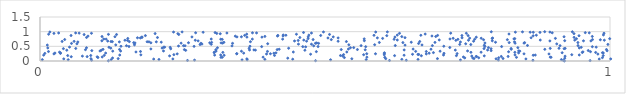
| Category | Series 0 |
|---|---|
| 2.2737618863979288 | 0.001 |
| 0.9201490768364133 | 0.002 |
| 1.637942919697557 | 0.003 |
| 1.9332591636446765 | 0.004 |
| 5.7513697663995185 | 0.005 |
| 0.1199243591047257 | 0.006 |
| 1.3459629498587193 | 0.007 |
| 2.8235011995106 | 0.008 |
| 2.5908782332994593 | 0.009 |
| 1.2472821126119067 | 0.01 |
| 0.4834265680161382 | 0.011 |
| 1.3550923501502299 | 0.012 |
| 0.9651213114938526 | 0.013 |
| 1.0503276894264808 | 0.014 |
| 0.9184804380166401 | 0.015 |
| 6.808566963321208 | 0.016 |
| 0.6130973295228077 | 0.017 |
| 0.2587598203045701 | 0.018 |
| 1.9505109192614207 | 0.019 |
| 3.041999003138373 | 0.02 |
| 1.7741115447497993 | 0.021 |
| 1.235638835491181 | 0.022 |
| 0.6426469469683878 | 0.023 |
| 0.8647900470202449 | 0.024 |
| 0.09055686671678105 | 0.025 |
| 5.7124977589136225 | 0.026 |
| 1.7970386531356328 | 0.027 |
| 1.1180586351951403 | 0.028 |
| 0.2711042657663187 | 0.029 |
| 2.6553249864528365 | 0.03 |
| 0.8041700297157369 | 0.031 |
| 1.0083012007380825 | 0.032 |
| 3.188801475636191 | 0.033 |
| 3.1223074125147625 | 0.034 |
| 0.7376257159724816 | 0.035 |
| 1.1725734008734259 | 0.036 |
| 3.5468961824369054 | 0.037 |
| 1.2234142543038955 | 0.038 |
| 0.3544746167344711 | 0.039 |
| 0.3634848110221066 | 0.04 |
| 1.0669616386722913 | 0.041 |
| 0.5098166116505487 | 0.042 |
| 1.2086782175219197 | 0.043 |
| 0.04944099229314223 | 0.044 |
| 0.12483589074286687 | 0.045 |
| 0.5722914466018544 | 0.046 |
| 0.00406532601859957 | 0.047 |
| 0.9147101971417547 | 0.048 |
| 12.370605432112834 | 0.049 |
| 4.275435959537002 | 0.05 |
| 1.6241533715467364 | 0.051 |
| 0.20871003611882857 | 0.052 |
| 0.6632247846768392 | 0.053 |
| 0.39453513590955197 | 0.054 |
| 1.084005431180274 | 0.055 |
| 0.6347967241977719 | 0.056 |
| 2.3130402979198865 | 0.057 |
| 21.55496418382264 | 0.058 |
| 8.705072408149316 | 0.059 |
| 2.291147821402007 | 0.06 |
| 0.44334860742283627 | 0.061 |
| 1.4254975818608817 | 0.062 |
| 4.954388326018369 | 0.063 |
| 1.1808995504827362 | 0.064 |
| 0.19945538311348912 | 0.065 |
| 0.98108874592036 | 0.066 |
| 1.5780867299864074 | 0.067 |
| 4.278486921999125 | 0.068 |
| 0.23308723261345093 | 0.069 |
| 0.8524692686644191 | 0.07 |
| 1.0012077757050155 | 0.071 |
| 0.04166261925096369 | 0.072 |
| 1.1017606722399127 | 0.073 |
| 0.3629464837657577 | 0.074 |
| 0.8001337196257015 | 0.075 |
| 0.5470924486998766 | 0.076 |
| 4.465401411932174 | 0.077 |
| 2.716980324089138 | 0.078 |
| 0.08936987108410721 | 0.079 |
| 0.6065458836068572 | 0.08 |
| 0.6973030293022336 | 0.081 |
| 0.1371451679134231 | 0.082 |
| 5.927345983378576 | 0.083 |
| 0.7613904571944045 | 0.084 |
| 3.5479450387986344 | 0.085 |
| 0.8123459583362767 | 0.086 |
| 2.459382552665395 | 0.087 |
| 1.3735500332739328 | 0.088 |
| 17.740580288287756 | 0.089 |
| 1.0175329874397123 | 0.09 |
| 1.143623569219701 | 0.091 |
| 1.4686245850103297 | 0.092 |
| 1.3968644469641271 | 0.093 |
| 0.920558718351481 | 0.094 |
| 2.273045874094044 | 0.095 |
| 1.583004406896495 | 0.096 |
| 0.43467468085175953 | 0.097 |
| 1.2614803461409139 | 0.098 |
| 2.7349068992450123 | 0.099 |
| 65.37573948646374 | 0.1 |
| 1.2833255822320353 | 0.101 |
| 3.6664434557282797 | 0.102 |
| 0.12729291170647578 | 0.103 |
| 0.759200787780231 | 0.104 |
| 1.4274821973001046 | 0.105 |
| 0.7452068325662645 | 0.106 |
| 1.5146465198141175 | 0.107 |
| 1.8110540108900455 | 0.108 |
| 1.0059369294740745 | 0.109 |
| 0.7696611351996713 | 0.11 |
| 0.8046610998039772 | 0.111 |
| 1.0443891530658989 | 0.112 |
| 1.078400195453555 | 0.113 |
| 0.9867020546977782 | 0.114 |
| 1.043097820988086 | 0.115 |
| 1.1459792185871365 | 0.116 |
| 0.5339408005533154 | 0.117 |
| 2.1088601837068093 | 0.118 |
| 0.10161447674316039 | 0.119 |
| 2.5818667793888985 | 0.12 |
| 1.6510797853707944 | 0.121 |
| 2.518806297097546 | 0.122 |
| 0.31753617233501247 | 0.123 |
| 0.8359169825181562 | 0.124 |
| 1.1645311916893735 | 0.125 |
| 0.6049270357202808 | 0.126 |
| 0.8966351490296917 | 0.127 |
| 1.2547997175001864 | 0.128 |
| 0.3199302370292503 | 0.129 |
| 0.5734955687387214 | 0.13 |
| 0.3914218449030481 | 0.131 |
| 0.8951487101318778 | 0.132 |
| 1.6829391647365306 | 0.133 |
| 1.137337357247225 | 0.134 |
| 3.3412183598379728 | 0.135 |
| 1.1040049673647971 | 0.136 |
| 0.7428082240551649 | 0.137 |
| 0.10915440716085027 | 0.138 |
| 16.91192482878406 | 0.139 |
| 6.5734203812502034 | 0.14 |
| 3.640575260608239 | 0.141 |
| 4.354169950055678 | 0.142 |
| 0.10029137807255618 | 0.143 |
| 1.1899304791380194 | 0.144 |
| 7.714545824322302 | 0.145 |
| 0.05484045574751575 | 0.146 |
| 1.007894467446645 | 0.147 |
| 3.264013512173796 | 0.148 |
| 2.9916956508237167 | 0.149 |
| 0.08271712814651296 | 0.15 |
| 1.3782184950992877 | 0.151 |
| 0.7658392417310818 | 0.152 |
| 0.7652219407164398 | 0.153 |
| 1.1339571528726062 | 0.154 |
| 0.8212609013225178 | 0.155 |
| 0.8092710590130394 | 0.156 |
| 5.082814763370822 | 0.157 |
| 28.16610247389053 | 0.158 |
| 1.6899678472150375 | 0.159 |
| 5.315276096586107 | 0.16 |
| 1.5425608200428846 | 0.161 |
| 1.4805083730957 | 0.162 |
| 2.3383970485315175 | 0.163 |
| 0.9211884525809446 | 0.164 |
| 1.050501645026555 | 0.165 |
| 0.07439627943184822 | 0.166 |
| 1.8681770549373122 | 0.167 |
| 0.7575411037291289 | 0.168 |
| 6.544935260203312 | 0.169 |
| 0.5310217310691344 | 0.17 |
| 3.341033380981517 | 0.171 |
| 3.128445057476509 | 0.172 |
| 2.705410339843755 | 0.173 |
| 0.22733406311859033 | 0.174 |
| 0.7794339091692223 | 0.175 |
| 2.2146379982471065 | 0.176 |
| 12.570547228396302 | 0.177 |
| 1.7110708124505591 | 0.178 |
| 0.6690979065407051 | 0.179 |
| 2.7718697939392247 | 0.18 |
| 1.347495572673457 | 0.181 |
| 0.7305695608418948 | 0.182 |
| 0.6220789767055507 | 0.183 |
| 0.988162549775029 | 0.184 |
| 0.048597583604752186 | 0.185 |
| 0.5271668396738207 | 0.186 |
| 11.883498201699268 | 0.187 |
| 0.08903335472464263 | 0.188 |
| 2.0726814063886505 | 0.189 |
| 0.41146497407149546 | 0.19 |
| 0.11272242991231074 | 0.191 |
| 22.18561689700371 | 0.192 |
| 1.7121823084165426 | 0.193 |
| 1.0211292412682127 | 0.194 |
| 0.3230658753032766 | 0.195 |
| 0.8653003604742302 | 0.196 |
| 0.6387691778196277 | 0.197 |
| 2.76539316240477 | 0.198 |
| 1.2644805356260644 | 0.199 |
| 0.006445884512780695 | 0.2 |
| 0.30639502095127735 | 0.201 |
| 0.8689336491419668 | 0.202 |
| 0.1399233877829866 | 0.203 |
| 0.7079326095873872 | 0.204 |
| 0.31697648630508063 | 0.205 |
| 0.9460785828855276 | 0.206 |
| 0.8333197909838489 | 0.207 |
| 1.252158444577964 | 0.208 |
| 0.17694926210844883 | 0.209 |
| 2.8763186891683357 | 0.21 |
| 1.1770113657196446 | 0.211 |
| 0.6040043154735528 | 0.212 |
| 1.2539480193184318 | 0.213 |
| 0.5678015014261861 | 0.214 |
| 0.932956389584935 | 0.215 |
| 0.23486821518726836 | 0.216 |
| 1.5495435009722909 | 0.217 |
| 0.5325894340451999 | 0.218 |
| 1.8623409428953097 | 0.219 |
| 4.628332619573756 | 0.22 |
| 1.1326968321786939 | 0.221 |
| 9.09382459741122 | 0.222 |
| 0.664440243766394 | 0.223 |
| 0.6630437852825857 | 0.224 |
| 3.5180975461268695 | 0.225 |
| 1.0133224752210745 | 0.226 |
| 1.2222867261317576 | 0.227 |
| 1.062608152724066 | 0.228 |
| 0.6535855177524948 | 0.229 |
| 4.455020077259548 | 0.23 |
| 0.4747673994285219 | 0.231 |
| 1.563322500604206 | 0.232 |
| 15.139084912272882 | 0.233 |
| 1.9539196485658437 | 0.234 |
| 2.4439244505875974 | 0.235 |
| 0.9787553050572654 | 0.236 |
| 1.1231179591585803 | 0.237 |
| 0.3974473908211905 | 0.238 |
| 14.533012611751886 | 0.239 |
| 0.8929742029603543 | 0.24 |
| 0.677731778869885 | 0.241 |
| 0.024446938310778894 | 0.242 |
| 0.24068726559489376 | 0.243 |
| 0.8491341946324361 | 0.244 |
| 0.34521485407315855 | 0.245 |
| 0.5885629353723268 | 0.246 |
| 0.4042312651370285 | 0.247 |
| 0.5732403260607346 | 0.248 |
| 5.766090682415213 | 0.249 |
| 1.6948849592365616 | 0.25 |
| 0.3452021167591629 | 0.251 |
| 0.731802391824487 | 0.252 |
| 1.201553675497355 | 0.253 |
| 4.667615545785956 | 0.254 |
| 6.832748105548758 | 0.255 |
| 0.6041017282407556 | 0.256 |
| 6.572066036032779 | 0.257 |
| 1.3240371363105297 | 0.258 |
| 0.00854388490256887 | 0.259 |
| 0.03587825814242838 | 0.26 |
| 0.7087209281583121 | 0.261 |
| 5.353956037222035 | 0.262 |
| 1.1661141681939686 | 0.263 |
| 0.41030144853015316 | 0.264 |
| 3.2789647381790856 | 0.265 |
| 0.6827336693604363 | 0.266 |
| 70.2879049137127 | 0.267 |
| 0.35737356077257215 | 0.268 |
| 1.8192894367570445 | 0.269 |
| 0.11516438780871754 | 0.27 |
| 0.0262249301117615 | 0.271 |
| 16.34465130256881 | 0.272 |
| 3.5344747077330507 | 0.273 |
| 0.9882841777758044 | 0.274 |
| 0.03592114789379566 | 0.275 |
| 0.8396528395337014 | 0.276 |
| 1.76448464487746 | 0.277 |
| 0.41396312113665296 | 0.278 |
| 0.6042409925661713 | 0.279 |
| 1.846464348058793 | 0.28 |
| 6.805421769908702 | 0.281 |
| 0.9160577468235621 | 0.282 |
| 0.9867214245763268 | 0.283 |
| 0.3056026160558402 | 0.284 |
| 1.517613282901204 | 0.285 |
| 0.6902327553635834 | 0.286 |
| 1.1184230740051775 | 0.287 |
| 1.1365907087758707 | 0.288 |
| 2.9552745098812427 | 0.289 |
| 3.351033991835301 | 0.29 |
| 0.9514000315361377 | 0.291 |
| 0.9748039849473574 | 0.292 |
| 0.3208189841172499 | 0.293 |
| 17.000653384763762 | 0.294 |
| 0.8330953364214729 | 0.295 |
| 0.7560291581590111 | 0.296 |
| 2.279829281353425 | 0.297 |
| 1.9469453263475238 | 0.298 |
| 12.927293966407001 | 0.299 |
| 0.7738445124210109 | 0.3 |
| 0.3058873737822847 | 0.301 |
| 0.034230371640119925 | 0.302 |
| 6.663432324190197 | 0.303 |
| 3.7629335834608693 | 0.304 |
| 1.0292637759249756 | 0.305 |
| 0.4444367015042964 | 0.306 |
| 0.538277877742771 | 0.307 |
| 0.16837357232047848 | 0.308 |
| 4.475766807802005 | 0.309 |
| 1.435612484422142 | 0.31 |
| 1.4977766002560018 | 0.311 |
| 0.9525102115682232 | 0.312 |
| 1.4057460815017235 | 0.313 |
| 1.7732600071859068 | 0.314 |
| 0.8221161692733965 | 0.315 |
| 29.383232697748817 | 0.316 |
| 1.0147135792044373 | 0.317 |
| 0.9657699318731382 | 0.318 |
| 0.48485793533732224 | 0.319 |
| 1.2618717489597104 | 0.32 |
| 1.0413651364173955 | 0.321 |
| 0.01488163740769182 | 0.322 |
| 0.6777281328759185 | 0.323 |
| 0.17628210153511017 | 0.324 |
| 1.5021036104557433 | 0.325 |
| 3.490406097336047 | 0.326 |
| 0.3990711718293762 | 0.327 |
| 0.6590590424630431 | 0.328 |
| 12.031298289882677 | 0.329 |
| 1.1799842746499987 | 0.33 |
| 1.2381961659861687 | 0.331 |
| 4.5947026414299845 | 0.332 |
| 0.3533829265520518 | 0.333 |
| 0.7019313648169873 | 0.334 |
| 1.5643400720805363 | 0.335 |
| 0.12761390467902559 | 0.336 |
| 0.8417942604544137 | 0.337 |
| 0.30897352472940776 | 0.338 |
| 0.14145582025349787 | 0.339 |
| 1.3026988443544523 | 0.34 |
| 0.10524083796371683 | 0.341 |
| 0.2166397281658121 | 0.342 |
| 0.750142751987342 | 0.343 |
| 0.8397391900135068 | 0.344 |
| 16.408512010722774 | 0.345 |
| 1.0648479301791185 | 0.346 |
| 2.082617779346103 | 0.347 |
| 1.1302812298046607 | 0.348 |
| 0.9949256675173913 | 0.349 |
| 2.637882902231591 | 0.35 |
| 23.023545546958132 | 0.351 |
| 15.516690657092715 | 0.352 |
| 0.7914515933361689 | 0.353 |
| 0.09091230038255743 | 0.354 |
| 1.0301761701085363 | 0.355 |
| 0.9618731099345217 | 0.356 |
| 1.9497752232076146 | 0.357 |
| 1.028376318020813 | 0.358 |
| 1.0204526425382643 | 0.359 |
| 2.5758066426944803 | 0.36 |
| 4.566794453352059 | 0.361 |
| 2.3592420229724813 | 0.362 |
| 0.25562664261230417 | 0.363 |
| 1.3970374131992733 | 0.364 |
| 1.1181948839225146 | 0.365 |
| 0.4647086534138529 | 0.366 |
| 0.1075260307936969 | 0.367 |
| 0.04700126637077851 | 0.368 |
| 3.0444420708970386 | 0.369 |
| 1.2473087526749254 | 0.37 |
| 0.37794015740143994 | 0.371 |
| 0.7286180407642846 | 0.372 |
| 1.4815772619650054 | 0.373 |
| 0.7852792469716068 | 0.374 |
| 1.7816291475997248 | 0.375 |
| 0.3676102629052058 | 0.376 |
| 0.6388917617113035 | 0.377 |
| 0.3753125597260041 | 0.378 |
| 15.843602545031876 | 0.379 |
| 1.2796990829702555 | 0.38 |
| 10.558838059551917 | 0.381 |
| 0.5705557095210874 | 0.382 |
| 1.6876294810124333 | 0.383 |
| 3.2767964851818547 | 0.384 |
| 1.3165837621556158 | 0.385 |
| 0.07975326970100426 | 0.386 |
| 0.30854542113022426 | 0.387 |
| 0.25329827000727323 | 0.388 |
| 0.4161007790971043 | 0.389 |
| 0.5285075328172233 | 0.39 |
| 0.5568463452734336 | 0.391 |
| 0.9937788101232115 | 0.392 |
| 2.0641602617522072 | 0.393 |
| 1.1389625269083203 | 0.394 |
| 0.1395643855192753 | 0.395 |
| 2.2286234217737704 | 0.396 |
| 0.11057085824488146 | 0.397 |
| 0.8856595279538029 | 0.398 |
| 1.0221512810117077 | 0.399 |
| 0.826711875531046 | 0.4 |
| 0.4196061126058985 | 0.401 |
| 0.6859527571584078 | 0.402 |
| 1.7479196712927008 | 0.403 |
| 2.4611951429193777 | 0.404 |
| 1.046972769978201 | 0.405 |
| 1.2282662307815353 | 0.406 |
| 0.6546223224830223 | 0.407 |
| 0.5410645040194441 | 0.408 |
| 3.2623443588652403 | 0.409 |
| 1.2385185582515057 | 0.41 |
| 0.19452613779205064 | 0.411 |
| 3.6405226636286683 | 0.412 |
| 1.2624920776268702 | 0.413 |
| 4.008045733014948 | 0.414 |
| 4.9799793967269 | 0.415 |
| 0.2293167838158966 | 0.416 |
| 2.509897386035619 | 0.417 |
| 4.0719261279478705 | 0.418 |
| 0.7913669723005905 | 0.419 |
| 0.9195075011829179 | 0.42 |
| 0.041057304701428474 | 0.421 |
| 51.269824891166486 | 0.422 |
| 0.7789780337478561 | 0.423 |
| 2.1501831422895865 | 0.424 |
| 1.8503567852459015 | 0.425 |
| 0.8265337691904416 | 0.426 |
| 1.202452015790991 | 0.427 |
| 0.06274265370747534 | 0.428 |
| 3.882060293585959 | 0.429 |
| 0.8951525796740996 | 0.43 |
| 0.9213449822333546 | 0.431 |
| 0.9105252069834051 | 0.432 |
| 50.99419887692103 | 0.433 |
| 0.36690462967084236 | 0.434 |
| 0.43621230971784836 | 0.435 |
| 1.8607748367886652 | 0.436 |
| 1.0162774619390362 | 0.437 |
| 0.12422827884741244 | 0.438 |
| 9.869694336640038 | 0.439 |
| 1.8361179190489538 | 0.44 |
| 0.21426640257610963 | 0.441 |
| 2.2576878668604965 | 0.442 |
| 1648.682715366966 | 0.443 |
| 4.457279565057609 | 0.444 |
| 0.01369556057646397 | 0.445 |
| 0.9460938537793527 | 0.446 |
| 2.3291370635530084 | 0.447 |
| 1.9776280198880207 | 0.448 |
| 1.0744748640105366 | 0.449 |
| 0.31126865640763307 | 0.45 |
| 0.08158426950527588 | 0.451 |
| 0.5446425029717294 | 0.452 |
| 1.0420337950031238 | 0.453 |
| 0.8383336363597765 | 0.454 |
| 5.843646577461754 | 0.455 |
| 0.5503808224471172 | 0.456 |
| 0.7867726665068117 | 0.457 |
| 1.6233914661868243 | 0.458 |
| 1.310713860231112 | 0.459 |
| 0.7189789932953116 | 0.46 |
| 5.299857841254989 | 0.461 |
| 1.0018229762342155 | 0.462 |
| 1.9261669975297853 | 0.463 |
| 1.3466275097487297 | 0.464 |
| 2.6369876401404144 | 0.465 |
| 0.22841896595809147 | 0.466 |
| 0.9495951847577849 | 0.467 |
| 0.21691199858644908 | 0.468 |
| 0.12095014984459398 | 0.469 |
| 0.21870720358842122 | 0.47 |
| 1.5824604086606722 | 0.471 |
| 0.975763102084299 | 0.472 |
| 71.92478774242929 | 0.473 |
| 0.051817867115229 | 0.474 |
| 2.2635481667626194 | 0.475 |
| 2.0232536304450153 | 0.476 |
| 1.6709008606720148 | 0.477 |
| 2.8633102481393973 | 0.478 |
| 1.769204260903613 | 0.479 |
| 1.1503695319250402 | 0.48 |
| 1.322763955899589 | 0.481 |
| 0.4660727735738656 | 0.482 |
| 1.3828808342081884 | 0.483 |
| 2.6874814093878316 | 0.484 |
| 1.4091907792732485 | 0.485 |
| 5.717264972463028 | 0.486 |
| 0.9690387059932354 | 0.487 |
| 0.5714113403720055 | 0.488 |
| 0.461015519433118 | 0.489 |
| 0.388915936128342 | 0.49 |
| 1.0860402628977206 | 0.491 |
| 0.8098540869981433 | 0.492 |
| 0.48786640464505304 | 0.493 |
| 0.15610950076192495 | 0.494 |
| 0.7805312860973629 | 0.495 |
| 1.5183740980482234 | 0.496 |
| 1.5653493500426787 | 0.497 |
| 7.168269133414226 | 0.498 |
| 0.27029239407713795 | 0.499 |
| 7.523000626089913 | 0.5 |
| 2.2324478324983232 | 0.501 |
| 0.14207680917375942 | 0.502 |
| 0.3683800570447453 | 0.503 |
| 0.7084499581990218 | 0.504 |
| 1.2530900445406905 | 0.505 |
| 1.3804127345641122 | 0.506 |
| 1.3550817141601565 | 0.507 |
| 1.9886254431761563 | 0.508 |
| 16.14999499050642 | 0.509 |
| 0.24303265619090927 | 0.51 |
| 1.040057923290151 | 0.511 |
| 2.1788473511854876 | 0.512 |
| 1.2496866916296092 | 0.513 |
| 4.259271756250503 | 0.514 |
| 0.3368598423780847 | 0.515 |
| 2.5231977309842892 | 0.516 |
| 0.480166808588292 | 0.517 |
| 1.8030907295035508 | 0.518 |
| 0.25441607372164726 | 0.519 |
| 2.268454715675386 | 0.52 |
| 0.15169171300746118 | 0.521 |
| 0.25183613142671096 | 0.522 |
| 0.9123665865660484 | 0.523 |
| 0.5633044474813229 | 0.524 |
| 0.6883520957222287 | 0.525 |
| 0.9439115617285425 | 0.526 |
| 0.6232942482908574 | 0.527 |
| 1.110767747368987 | 0.528 |
| 1.8671870388075416 | 0.529 |
| 0.8552181259803232 | 0.53 |
| 1.3348169526459497 | 0.531 |
| 6.428319274998158 | 0.532 |
| 30.015390313561397 | 0.533 |
| 1.1056491846935164 | 0.534 |
| 0.7794008008150547 | 0.535 |
| 1.9365495374863664 | 0.536 |
| 13.714528403660383 | 0.537 |
| 7.811405355604447 | 0.538 |
| 1.0610205065509997 | 0.539 |
| 1.537149194121077 | 0.54 |
| 0.6404250429978879 | 0.541 |
| 1.0617078844685464 | 0.542 |
| 0.012841507926568733 | 0.543 |
| 1.161060416947643 | 0.544 |
| 1.2615061397474148 | 0.545 |
| 7.249614877715457 | 0.546 |
| 0.6701865375635632 | 0.547 |
| 1.447838652453678 | 0.548 |
| 0.13289560959554064 | 0.549 |
| 12.712762215230775 | 0.55 |
| 0.16574949019439936 | 0.551 |
| 1.2007283830627895 | 0.552 |
| 0.5418384958209289 | 0.553 |
| 1.6287389450097627 | 0.554 |
| 0.5871218928452039 | 0.555 |
| 1.5183337192958999 | 0.556 |
| 19.303199407800204 | 0.557 |
| 4.0498103514115815 | 0.558 |
| 1.3238975598237055 | 0.559 |
| 14.750629573571278 | 0.56 |
| 0.7557661824102366 | 0.561 |
| 0.2808239091357753 | 0.562 |
| 1.0261516055650128 | 0.563 |
| 1.1819240913019116 | 0.564 |
| 0.9963041552571948 | 0.565 |
| 0.736400149836113 | 0.566 |
| 1.0317051325963726 | 0.567 |
| 0.30040206239324163 | 0.568 |
| 6.716100317759607 | 0.569 |
| 1.9885289505813357 | 0.57 |
| 1.2920917842404074 | 0.571 |
| 1.5167362130927546 | 0.572 |
| 0.4762503003713989 | 0.573 |
| 4.625572311425819 | 0.574 |
| 0.4534539938796518 | 0.575 |
| 1.7039134681653882 | 0.576 |
| 0.28409131716194314 | 0.577 |
| 5.962228323557456 | 0.578 |
| 1.2774050437292181 | 0.579 |
| 1.473037275280555 | 0.58 |
| 3.0783543209567807 | 0.581 |
| 39.88969943790155 | 0.582 |
| 0.9065708396904912 | 0.583 |
| 55.71082703287804 | 0.584 |
| 8.17687721059887 | 0.585 |
| 0.064805168510744 | 0.586 |
| 0.7468235326607228 | 0.587 |
| 1.679200281026202 | 0.588 |
| 0.3994590269008865 | 0.589 |
| 1.91157529350075 | 0.59 |
| 3.294735888387264 | 0.591 |
| 2.2856182094876116 | 0.592 |
| 4.525878186983015 | 0.593 |
| 2.1922590575290215 | 0.594 |
| 9.437638142076604 | 0.595 |
| 1.0022184827767695 | 0.596 |
| 0.6642510922980407 | 0.597 |
| 8.605952563919802 | 0.598 |
| 0.055281928614946844 | 0.599 |
| 3.392986606396465 | 0.6 |
| 0.48871244926660895 | 0.601 |
| 0.33783136953644494 | 0.602 |
| 1.2958882541043357 | 0.603 |
| 0.4832726425732507 | 0.604 |
| 1.8142696791484243 | 0.605 |
| 0.2823542664788357 | 0.606 |
| 0.8335153151590555 | 0.607 |
| 0.247554744937728 | 0.608 |
| 0.8491728947627505 | 0.609 |
| 0.32039784737196386 | 0.61 |
| 1.7544518328412257 | 0.611 |
| 1.2361496064206663 | 0.612 |
| 1.5468484382300884 | 0.613 |
| 0.7806238806207033 | 0.614 |
| 0.48540244860257536 | 0.615 |
| 0.166633279755771 | 0.616 |
| 0.31772636545141725 | 0.617 |
| 12.149040534820953 | 0.618 |
| 0.2977541300621589 | 0.619 |
| 0.19456074387560998 | 0.62 |
| 1.004795214123153 | 0.621 |
| 1.5257926700337077 | 0.622 |
| 0.26050179638283943 | 0.623 |
| 2.230069702246257 | 0.624 |
| 0.1644051007632084 | 0.625 |
| 0.8502075622809685 | 0.626 |
| 0.8231544995305813 | 0.627 |
| 0.6366616494336966 | 0.628 |
| 0.9436859641606671 | 0.629 |
| 1.0173058501682568 | 0.63 |
| 0.5953585676045335 | 0.631 |
| 1.5842254374427256 | 0.632 |
| 0.3011083932941921 | 0.633 |
| 0.6929350664254075 | 0.634 |
| 1.2686291658217324 | 0.635 |
| 1.2233183265126475 | 0.636 |
| 4.735147850579935 | 0.637 |
| 0.3226506081184836 | 0.638 |
| 0.7991916110087509 | 0.639 |
| 0.651340490390984 | 0.64 |
| 4.708318451201212 | 0.641 |
| 0.2127008360445248 | 0.642 |
| 1.237629197789991 | 0.643 |
| 1.3919002975902064 | 0.644 |
| 184.22372589434792 | 0.645 |
| 3.6240663809971996 | 0.646 |
| 2.201919671342088 | 0.647 |
| 0.7375582058348927 | 0.648 |
| 0.06641922052120174 | 0.649 |
| 4.436760765768188 | 0.65 |
| 0.13919996226900952 | 0.651 |
| 0.8324528066467576 | 0.652 |
| 0.20406920453774358 | 0.653 |
| 0.19112249206959622 | 0.654 |
| 6.431552531466102 | 0.655 |
| 0.18795673131332635 | 0.656 |
| 0.3691547351707033 | 0.657 |
| 1.3213546961439928 | 0.658 |
| 0.1269505681917171 | 0.659 |
| 4.465040176788595 | 0.66 |
| 0.15672780971830874 | 0.661 |
| 1.3194737548580595 | 0.662 |
| 0.5375380243791007 | 0.663 |
| 0.12454949191459189 | 0.664 |
| 0.6661883671016549 | 0.665 |
| 1.3240551600416792 | 0.666 |
| 0.03880927565346791 | 0.667 |
| 1.9817117012014573 | 0.668 |
| 2.402440809215979 | 0.669 |
| 0.05981842616470885 | 0.67 |
| 2.1102911327967004 | 0.671 |
| 1.122303613740837 | 0.672 |
| 0.5230149973242413 | 0.673 |
| 4.633517409665424 | 0.674 |
| 0.7607077873045999 | 0.675 |
| 0.4677089983986396 | 0.676 |
| 1.6729324118106768 | 0.677 |
| 1.8965670168312083 | 0.678 |
| 0.11876473270835095 | 0.679 |
| 1.8701948835740552 | 0.68 |
| 3.6425174607221944 | 0.681 |
| 2.011367349304718 | 0.682 |
| 0.44656473848376754 | 0.683 |
| 0.8945329210080344 | 0.684 |
| 0.9665361323782187 | 0.685 |
| 0.27738512172640073 | 0.686 |
| 0.9534699684414648 | 0.687 |
| 0.10849138327024639 | 0.688 |
| 0.7935339302273169 | 0.689 |
| 1.6344366539190769 | 0.69 |
| 1.5593264306015777 | 0.691 |
| 0.5690176477261497 | 0.692 |
| 0.9205790624138093 | 0.693 |
| 1.0199395248486 | 0.694 |
| 1.1232488298104635 | 0.695 |
| 1.585981371178573 | 0.696 |
| 1.7186257023766753 | 0.697 |
| 3.866910417808744 | 0.698 |
| 5.296649955301455 | 0.699 |
| 0.45294988699073935 | 0.7 |
| 131.34057989586 | 0.701 |
| 0.1535796441525382 | 0.702 |
| 1.1223710382383636 | 0.703 |
| 1.936684880794036 | 0.704 |
| 0.729634379491013 | 0.705 |
| 0.7516789452252157 | 0.706 |
| 0.2724390841985789 | 0.707 |
| 0.14901571050836887 | 0.708 |
| 0.9900836151941261 | 0.709 |
| 1.7763356007555104 | 0.71 |
| 0.9381392811127489 | 0.711 |
| 1.2031623116036676 | 0.712 |
| 0.4627862534482085 | 0.713 |
| 0.877658358040129 | 0.714 |
| 0.6268892937073285 | 0.715 |
| 2.8899253995251373 | 0.716 |
| 0.7004100162721131 | 0.717 |
| 1.783920885846955 | 0.718 |
| 1.422044933256213 | 0.719 |
| 7.712132035603997 | 0.72 |
| 7.037728345035627 | 0.721 |
| 1.5288024132752294 | 0.722 |
| 1.6593324316239266 | 0.723 |
| 0.9830809252043189 | 0.724 |
| 0.7782344051221259 | 0.725 |
| 1.3192366948183736 | 0.726 |
| 0.819932080257565 | 0.727 |
| 219.01693112869145 | 0.728 |
| 0.5110422578176816 | 0.729 |
| 0.9692754973660666 | 0.73 |
| 0.47914324670417324 | 0.731 |
| 0.04334893487629193 | 0.732 |
| 4.129162331621401 | 0.733 |
| 1.9855386559497956 | 0.734 |
| 2.084651561256276 | 0.735 |
| 1.337791195466106 | 0.736 |
| 259.2672430190367 | 0.737 |
| 0.3197542645231372 | 0.738 |
| 0.7331654040554689 | 0.739 |
| 0.62129154559179 | 0.74 |
| 2.543403017991548 | 0.741 |
| 0.7625747096224491 | 0.742 |
| 0.31714090734654177 | 0.743 |
| 7.661438028640463 | 0.744 |
| 0.4256925220140704 | 0.745 |
| 0.11599027049612062 | 0.746 |
| 0.3725491355299274 | 0.747 |
| 1.259414561640732 | 0.748 |
| 0.3003874791886013 | 0.749 |
| 0.11178819299012818 | 0.75 |
| 0.7192497176589328 | 0.751 |
| 1.8479848301902897 | 0.752 |
| 1.3012218316515334 | 0.753 |
| 0.8314964380863787 | 0.754 |
| 0.5687631515823868 | 0.755 |
| 1.564501474202996 | 0.756 |
| 3.4139490066155997 | 0.757 |
| 2.177847129656944 | 0.758 |
| 0.9411377964646649 | 0.759 |
| 4.886260173253639 | 0.76 |
| 0.9994519495275083 | 0.761 |
| 3.107379462542069 | 0.762 |
| 0.8329580508941594 | 0.763 |
| 0.4703937004825495 | 0.764 |
| 1.5602351771319984 | 0.765 |
| 12.83633303281225 | 0.766 |
| 0.7933653806381847 | 0.767 |
| 2.2851104488223024 | 0.768 |
| 0.15405375579701386 | 0.769 |
| 0.6011103873341097 | 0.77 |
| 0.9042181321634678 | 0.771 |
| 2.51535727580706 | 0.772 |
| 164.54059806234116 | 0.773 |
| 0.7248165224610781 | 0.774 |
| 0.774058136252719 | 0.775 |
| 1.395723387240567 | 0.776 |
| 3.7390608400392544 | 0.777 |
| 0.7537874232829886 | 0.778 |
| 1.646656015424305 | 0.779 |
| 1.1256033425145793 | 0.78 |
| 1.0501042496622293 | 0.781 |
| 1.3730727530917626 | 0.782 |
| 1.7782449279813048 | 0.783 |
| 0.7940027863000262 | 0.784 |
| 0.5051973611522163 | 0.785 |
| 0.17610137619172433 | 0.786 |
| 0.523030044912876 | 0.787 |
| 0.5918860153054695 | 0.788 |
| 6.534781713116626 | 0.789 |
| 0.7404581750042754 | 0.79 |
| 0.17100458163321997 | 0.791 |
| 1.548170609026323 | 0.792 |
| 0.8616208968669721 | 0.793 |
| 6.099163983574148 | 0.794 |
| 1.3293741979299243 | 0.795 |
| 0.6403520317597157 | 0.796 |
| 2.554939604891827 | 0.797 |
| 1.8883065474216163 | 0.798 |
| 1.1572719967100562 | 0.799 |
| 0.2060717865315661 | 0.8 |
| 0.4559130366823423 | 0.801 |
| 1.1024752904978334 | 0.802 |
| 0.08169329673241663 | 0.803 |
| 0.17887133087103574 | 0.804 |
| 2.3147471971683093 | 0.805 |
| 0.9370124562775611 | 0.806 |
| 1.5097609353425498 | 0.807 |
| 4.8602059421147 | 0.808 |
| 19.276699625009208 | 0.809 |
| 1.8387758316875076 | 0.81 |
| 1.0659043691801477 | 0.811 |
| 0.7654292564145478 | 0.812 |
| 0.3894027010058925 | 0.813 |
| 0.36305503467177963 | 0.814 |
| 2.3217679307477024 | 0.815 |
| 0.6226626064906001 | 0.816 |
| 1.8327056155050874 | 0.817 |
| 1.0156167774215197 | 0.818 |
| 0.1788715320662707 | 0.819 |
| 0.266587512068959 | 0.82 |
| 0.3455704074082704 | 0.821 |
| 0.5144817294644597 | 0.822 |
| 0.4705047690910685 | 0.823 |
| 1.5290545089339487 | 0.824 |
| 0.3533518387813999 | 0.825 |
| 2.6632893679082423 | 0.826 |
| 0.9194096854882483 | 0.827 |
| 0.13148323257702696 | 0.828 |
| 33.99123521823379 | 0.829 |
| 5.995285884286602 | 0.83 |
| 0.6347492156044076 | 0.831 |
| 1.0828281735088505 | 0.832 |
| 1.0064994519048918 | 0.833 |
| 0.1088245889352137 | 0.834 |
| 5.289708518767688 | 0.835 |
| 0.6943512585169481 | 0.836 |
| 0.9689615748661287 | 0.837 |
| 0.39459868474691207 | 0.838 |
| 4.555935045487478 | 0.839 |
| 6.730269759797113 | 0.84 |
| 1.042529229233441 | 0.841 |
| 6.622394890027247 | 0.842 |
| 4.597037313609666 | 0.843 |
| 6.28563886081198 | 0.844 |
| 1.3652952526452016 | 0.845 |
| 2.1493788673954324 | 0.846 |
| 0.34262767519965404 | 0.847 |
| 1.9453076582075406 | 0.848 |
| 0.08423784818324169 | 0.849 |
| 1.4463129524815288 | 0.85 |
| 0.4166253577448426 | 0.851 |
| 0.6876478393544487 | 0.852 |
| 1.1090980774815746 | 0.853 |
| 0.426439482954486 | 0.854 |
| 1.0141107932354998 | 0.855 |
| 3.675416556039297 | 0.856 |
| 1.5879699890527512 | 0.857 |
| 8.528078827390386 | 0.858 |
| 0.8652331970493776 | 0.859 |
| 38.29213976021438 | 0.86 |
| 2.0590373647786366 | 0.861 |
| 0.9456466143483244 | 0.862 |
| 4.443466275228124 | 0.863 |
| 0.6083959193395617 | 0.864 |
| 2.445758203828178 | 0.865 |
| 0.18491571860738262 | 0.866 |
| 0.7510346936324139 | 0.867 |
| 0.7402172013573922 | 0.868 |
| 0.05449037540636172 | 0.869 |
| 0.4924297016089945 | 0.87 |
| 2.7804401164771146 | 0.871 |
| 0.4173698510366744 | 0.872 |
| 0.6975418473616197 | 0.873 |
| 0.35910648894004027 | 0.874 |
| 0.585958010545229 | 0.875 |
| 1.5831568138910441 | 0.876 |
| 0.6681791399025214 | 0.877 |
| 0.43142965679906703 | 0.878 |
| 0.8707899161393039 | 0.879 |
| 1.5192825759425719 | 0.88 |
| 1.5269633118924744 | 0.881 |
| 4.321715653542606 | 0.882 |
| 0.4716948062612082 | 0.883 |
| 0.6268433767519427 | 0.884 |
| 1.4690569393560178 | 0.885 |
| 0.4267129492836564 | 0.886 |
| 1.892049494427501 | 0.887 |
| 2.7200028299341694 | 0.888 |
| 0.988477608898191 | 0.889 |
| 1.0146622866048156 | 0.89 |
| 2.3701744879830526 | 0.891 |
| 10.557527138463193 | 0.892 |
| 1.7147099580378482 | 0.893 |
| 16.694566011365765 | 0.894 |
| 1.0176730497890027 | 0.895 |
| 1.2609558829251453 | 0.896 |
| 1.575440170692862 | 0.897 |
| 2.0993120842636017 | 0.898 |
| 2.8721888085519094 | 0.899 |
| 2.7454966336509754 | 0.9 |
| 0.07739731000644563 | 0.901 |
| 2.376349604755693 | 0.902 |
| 0.13430375891631696 | 0.903 |
| 0.24348343354010973 | 0.904 |
| 4.1774947367186135 | 0.905 |
| 0.507954334002652 | 0.906 |
| 1.8722105134005098 | 0.907 |
| 0.1201095653472336 | 0.908 |
| 2.1153449079469326 | 0.909 |
| 1.6749728537699098 | 0.91 |
| 1.6040652146041035 | 0.911 |
| 0.4498873280860227 | 0.912 |
| 0.015190546292183887 | 0.913 |
| 2.927919321854112 | 0.914 |
| 2.412887360648463 | 0.915 |
| 0.36268459066972547 | 0.916 |
| 1.0949582272829974 | 0.917 |
| 4.254884786443647 | 0.918 |
| 0.6757451921992139 | 0.919 |
| 0.8227875181300415 | 0.92 |
| 1.4911629495955492 | 0.921 |
| 5.25589322192467 | 0.922 |
| 1.5455353408540706 | 0.923 |
| 1.762698057441505 | 0.924 |
| 8.039328631976758 | 0.925 |
| 2.0295747629019725 | 0.926 |
| 1.9525207738616066 | 0.927 |
| 3.861929219348085 | 0.928 |
| 0.3162661598549603 | 0.929 |
| 5.110553558791936 | 0.93 |
| 1.0936775707346047 | 0.931 |
| 0.24186104191839652 | 0.932 |
| 0.936806373869453 | 0.933 |
| 11.02621901437008 | 0.934 |
| 0.20196838357818808 | 0.935 |
| 4.607881740780828 | 0.936 |
| 1.3029932122992505 | 0.937 |
| 5.2414686302361595 | 0.938 |
| 10.219622090315694 | 0.939 |
| 0.3101831815752838 | 0.94 |
| 0.02447777209554386 | 0.941 |
| 1.3693859717251233 | 0.942 |
| 0.6307262517604654 | 0.943 |
| 0.09030817131978022 | 0.944 |
| 0.7479822060432155 | 0.945 |
| 0.9894474686417783 | 0.946 |
| 1.0801066335337537 | 0.947 |
| 1.0209397785953307 | 0.948 |
| 0.7205476978600963 | 0.949 |
| 0.06868391517221056 | 0.95 |
| 4.566380966972323 | 0.951 |
| 3.218017487093928 | 0.952 |
| 0.47624765054831175 | 0.953 |
| 0.32790953005418755 | 0.954 |
| 0.032712695496852365 | 0.955 |
| 0.06250611970667291 | 0.956 |
| 0.37992063562730394 | 0.957 |
| 2.7299573897322387 | 0.958 |
| 0.9636402693440508 | 0.959 |
| 0.3727551066437898 | 0.96 |
| 0.8986464320043128 | 0.961 |
| 0.27305313892688815 | 0.962 |
| 2.3577279393950503 | 0.963 |
| 1.397625559262429 | 0.964 |
| 64.80165542726402 | 0.965 |
| 0.9566594101759495 | 0.966 |
| 3.048472313335615 | 0.967 |
| 1.3771382484197225 | 0.968 |
| 0.3072045704804965 | 0.969 |
| 4.008541273694061 | 0.97 |
| 1.3389075171705764 | 0.971 |
| 0.4623446358884668 | 0.972 |
| 1.025318286908728 | 0.973 |
| 6.567289004393504 | 0.974 |
| 0.8771869364244647 | 0.975 |
| 1.4913020896686526 | 0.976 |
| 1.910722323081643 | 0.977 |
| 1.276147539434024 | 0.978 |
| 0.8653818443083392 | 0.979 |
| 0.28621290283097617 | 0.98 |
| 1.6986043672161009 | 0.981 |
| 0.8599391746720595 | 0.982 |
| 0.8339944090274618 | 0.983 |
| 1.0471236214928141 | 0.984 |
| 1.3643967671287596 | 0.985 |
| 0.8945935474028207 | 0.986 |
| 0.23428808102430046 | 0.987 |
| 0.5889423624801425 | 0.988 |
| 0.01733093389408389 | 0.989 |
| 0.4972814052276518 | 0.99 |
| 0.24929981718199065 | 0.991 |
| 0.6094232523911622 | 0.992 |
| 0.8464879262067841 | 0.993 |
| 1.0463121734415202 | 0.994 |
| 0.933945655988991 | 0.995 |
| 0.7917435214771985 | 0.996 |
| 2.2817550178344135 | 0.997 |
| 2.5515577609146978 | 0.998 |
| 0.8854639927729969 | 0.999 |
| 17.21757514142622 | 1 |